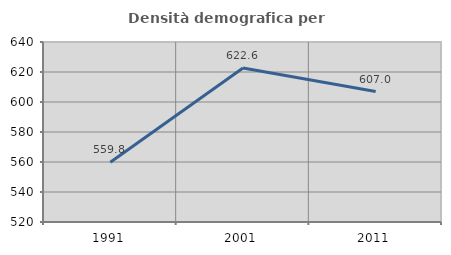
| Category | Densità demografica |
|---|---|
| 1991.0 | 559.784 |
| 2001.0 | 622.644 |
| 2011.0 | 606.979 |